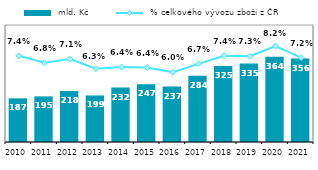
| Category |  mld. Kč |
|---|---|
| 2010.0 | 186.551 |
| 2011.0 | 194.971 |
| 2012.0 | 217.71 |
| 2013.0 | 198.836 |
| 2014.0 | 232.424 |
| 2015.0 | 247.168 |
| 2016.0 | 236.892 |
| 2017.0 | 283.506 |
| 2018.0 | 324.867 |
| 2019.0 | 335.466 |
| 2020.0 | 364.383 |
| 2021.0 | 356.328 |